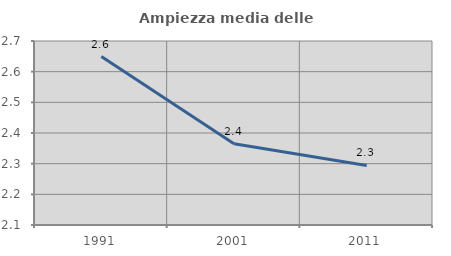
| Category | Ampiezza media delle famiglie |
|---|---|
| 1991.0 | 2.649 |
| 2001.0 | 2.365 |
| 2011.0 | 2.294 |